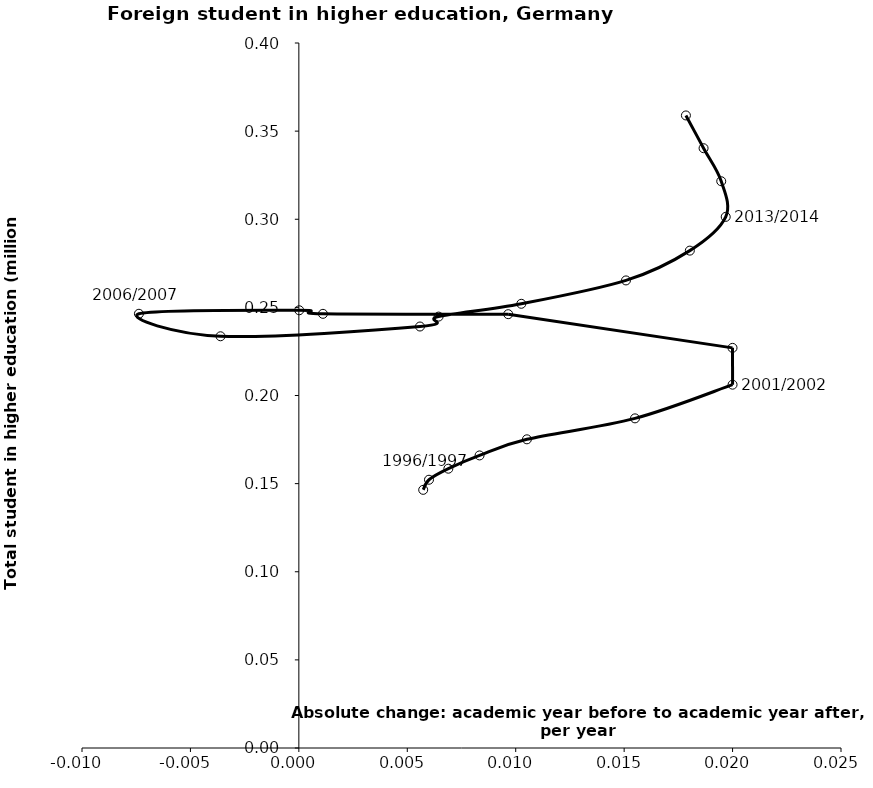
| Category | Series 0 |
|---|---|
| 0.005733999999999961 | 0.146 |
| 0.006000999999999979 | 0.152 |
| 0.006894000000000011 | 0.158 |
| 0.008333000000000007 | 0.166 |
| 0.010516499999999998 | 0.175 |
| 0.0155005 | 0.187 |
| 0.019999500000000003 | 0.206 |
| 0.0199975 | 0.227 |
| 0.009653999999999996 | 0.246 |
| 0.0011105000000000004 | 0.246 |
| 1.7500000000003624e-05 | 0.248 |
| -0.007375499999999993 | 0.246 |
| -0.003613000000000005 | 0.234 |
| 0.005585000000000007 | 0.239 |
| 0.00644450000000002 | 0.245 |
| 0.010257999999999975 | 0.252 |
| 0.0150845 | 0.265 |
| 0.018029000000000017 | 0.282 |
| 0.01968399999999998 | 0.301 |
| 0.01947750000000001 | 0.322 |
| 0.018662999999999985 | 0.34 |
| 0.01784849999999996 | 0.359 |